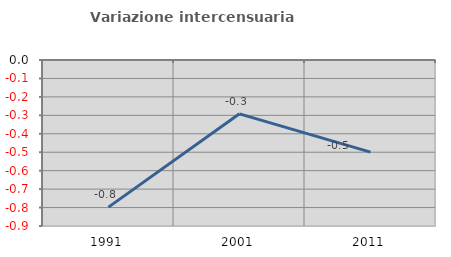
| Category | Variazione intercensuaria annua |
|---|---|
| 1991.0 | -0.798 |
| 2001.0 | -0.292 |
| 2011.0 | -0.499 |